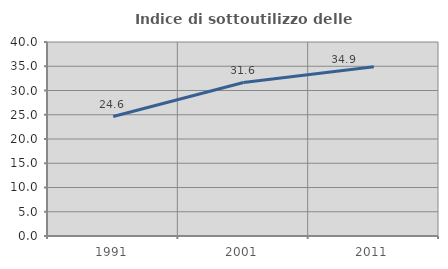
| Category | Indice di sottoutilizzo delle abitazioni  |
|---|---|
| 1991.0 | 24.626 |
| 2001.0 | 31.649 |
| 2011.0 | 34.895 |